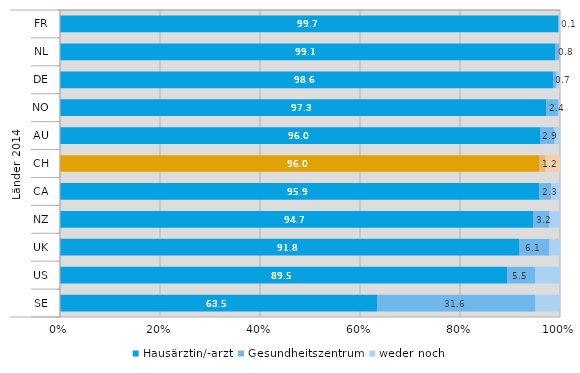
| Category | Hausärztin/-arzt | Gesundheitszentrum | weder noch |
|---|---|---|---|
| 0 | 99.7 | 0.1 | 0.2 |
| 1 | 99.1 | 0.8 | 0.1 |
| 2 | 98.6 | 0.7 | 0.7 |
| 3 | 97.3 | 2.4 | 0.3 |
| 4 | 96 | 2.9 | 1.1 |
| 5 | 96 | 1.2 | 2.9 |
| 6 | 95.9 | 2.3 | 1.8 |
| 7 | 94.7 | 3.2 | 2.1 |
| 8 | 91.8 | 6.1 | 2.1 |
| 9 | 89.5 | 5.5 | 5 |
| 10 | 63.5 | 31.6 | 4.9 |